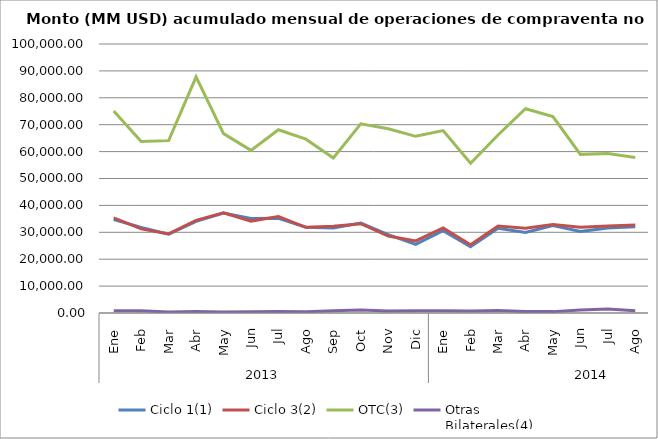
| Category | Ciclo 1(1) | Ciclo 3(2) | OTC(3) | Otras
Bilaterales(4) |
|---|---|---|---|---|
| 0 | 34736.674 | 35336.778 | 75100.994 | 862.558 |
| 1 | 31837.301 | 31276.084 | 63735.014 | 835.426 |
| 2 | 29308.645 | 29417.861 | 64070.642 | 371.583 |
| 3 | 34083.554 | 34428.23 | 87796.406 | 540.738 |
| 4 | 37163.38 | 37242.543 | 66687.424 | 368.797 |
| 5 | 35163.266 | 34165.361 | 60467.987 | 473.52 |
| 6 | 35197.057 | 35828.881 | 68121.887 | 537.978 |
| 7 | 31913.776 | 31846.832 | 64630.867 | 477.656 |
| 8 | 31601.855 | 32260.646 | 57599.123 | 864.94 |
| 9 | 33455.872 | 33201.092 | 70316.044 | 1074.052 |
| 10 | 29141.89 | 28620.849 | 68482.193 | 758.559 |
| 11 | 25532.796 | 26816.016 | 65678.317 | 842.072 |
| 12 | 30609.998 | 31608.391 | 67807.808 | 838.473 |
| 13 | 24661.445 | 25355.64 | 55646.165 | 717.558 |
| 14 | 31490.456 | 32327.003 | 66188.016 | 905.778 |
| 15 | 29968.466 | 31511.409 | 75953.393 | 552.114 |
| 16 | 32511.8 | 32893.552 | 73041.006 | 512.251 |
| 17 | 30347.815 | 31837.962 | 58974.75 | 1157.814 |
| 18 | 31634.299 | 32380.251 | 59280.214 | 1471.651 |
| 19 | 32084.514 | 32686.117 | 57820.266 | 827.326 |